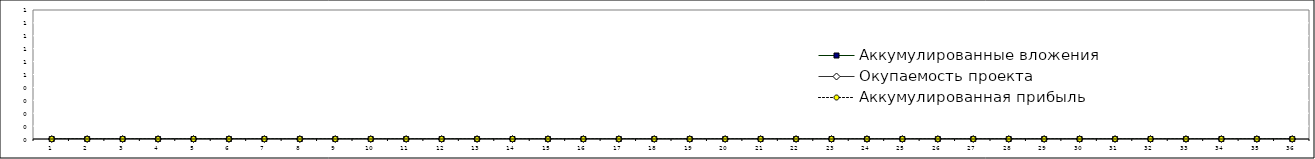
| Category | Аккумулированные вложения | Окупаемость проекта | Аккумулированная прибыль |
|---|---|---|---|
| 0 | 0 | 0 | 0 |
| 1 | 0 | 0 | 0 |
| 2 | 0 | 0 | 0 |
| 3 | 0 | 0 | 0 |
| 4 | 0 | 0 | 0 |
| 5 | 0 | 0 | 0 |
| 6 | 0 | 0 | 0 |
| 7 | 0 | 0 | 0 |
| 8 | 0 | 0 | 0 |
| 9 | 0 | 0 | 0 |
| 10 | 0 | 0 | 0 |
| 11 | 0 | 0 | 0 |
| 12 | 0 | 0 | 0 |
| 13 | 0 | 0 | 0 |
| 14 | 0 | 0 | 0 |
| 15 | 0 | 0 | 0 |
| 16 | 0 | 0 | 0 |
| 17 | 0 | 0 | 0 |
| 18 | 0 | 0 | 0 |
| 19 | 0 | 0 | 0 |
| 20 | 0 | 0 | 0 |
| 21 | 0 | 0 | 0 |
| 22 | 0 | 0 | 0 |
| 23 | 0 | 0 | 0 |
| 24 | 0 | 0 | 0 |
| 25 | 0 | 0 | 0 |
| 26 | 0 | 0 | 0 |
| 27 | 0 | 0 | 0 |
| 28 | 0 | 0 | 0 |
| 29 | 0 | 0 | 0 |
| 30 | 0 | 0 | 0 |
| 31 | 0 | 0 | 0 |
| 32 | 0 | 0 | 0 |
| 33 | 0 | 0 | 0 |
| 34 | 0 | 0 | 0 |
| 35 | 0 | 0 | 0 |